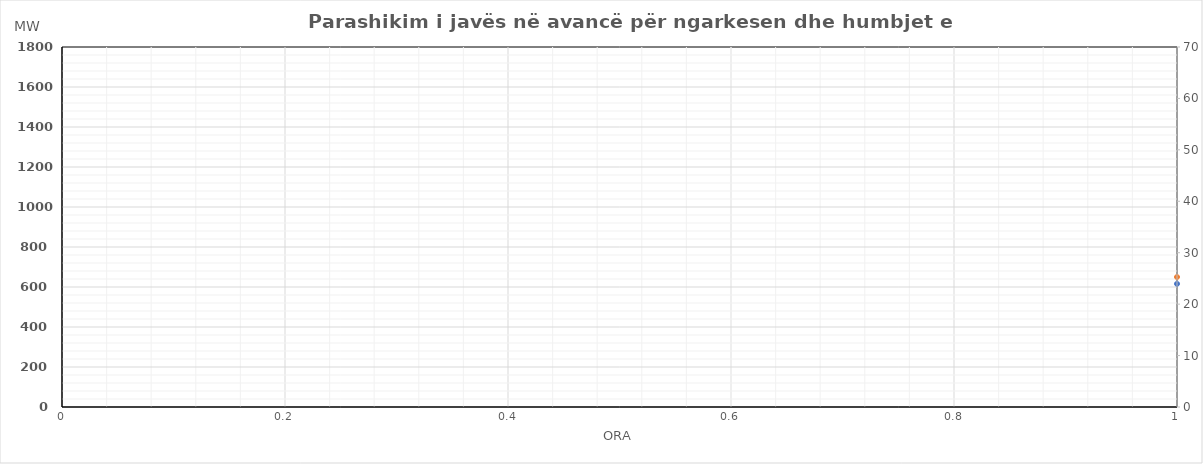
| Category | Ngarkesa (MWh) |
|---|---|
| 0 | 649.95 |
| 1 | 598.35 |
| 2 | 594.85 |
| 3 | 591.86 |
| 4 | 592.15 |
| 5 | 598.76 |
| 6 | 796.39 |
| 7 | 1085.77 |
| 8 | 1193.92 |
| 9 | 1168.14 |
| 10 | 1131.74 |
| 11 | 1086.17 |
| 12 | 1060.81 |
| 13 | 1088.71 |
| 14 | 1125.69 |
| 15 | 1158.7 |
| 16 | 1250.84 |
| 17 | 1372.91 |
| 18 | 1385.93 |
| 19 | 1371.35 |
| 20 | 1342.96 |
| 21 | 1236.96 |
| 22 | 1061.14 |
| 23 | 857.15 |
| 24 | 700.24 |
| 25 | 615.14 |
| 26 | 584.74 |
| 27 | 572.34 |
| 28 | 571.64 |
| 29 | 645.24 |
| 30 | 847.38 |
| 31 | 1139.75 |
| 32 | 1242.28 |
| 33 | 1242.51 |
| 34 | 1205.3 |
| 35 | 1178.14 |
| 36 | 1216.19 |
| 37 | 1248.5 |
| 38 | 1358.46 |
| 39 | 1353.03 |
| 40 | 1421.7 |
| 41 | 1512.33 |
| 42 | 1556.55 |
| 43 | 1547.36 |
| 44 | 1512.56 |
| 45 | 1397.47 |
| 46 | 1197.34 |
| 47 | 974.55 |
| 48 | 739.19 |
| 49 | 651.79 |
| 50 | 608.37 |
| 51 | 608.19 |
| 52 | 606.49 |
| 53 | 668.79 |
| 54 | 874.33 |
| 55 | 1180.21 |
| 56 | 1291.17 |
| 57 | 1282.58 |
| 58 | 1315.98 |
| 59 | 1194.13 |
| 60 | 1177.57 |
| 61 | 1177.07 |
| 62 | 1221.26 |
| 63 | 1260.21 |
| 64 | 1349.05 |
| 65 | 1474.31 |
| 66 | 1507.31 |
| 67 | 1484.64 |
| 68 | 1453.93 |
| 69 | 1336.85 |
| 70 | 1132.86 |
| 71 | 922.96 |
| 72 | 738.7 |
| 73 | 643.9 |
| 74 | 599.88 |
| 75 | 586.29 |
| 76 | 596.07 |
| 77 | 673.96 |
| 78 | 900.69 |
| 79 | 1221.8 |
| 80 | 1324.28 |
| 81 | 1315.42 |
| 82 | 1243.47 |
| 83 | 1190.88 |
| 84 | 1100.59 |
| 85 | 1129.37 |
| 86 | 1171.71 |
| 87 | 1228.78 |
| 88 | 1320.75 |
| 89 | 1470.45 |
| 90 | 1537.15 |
| 91 | 1525.06 |
| 92 | 1483.43 |
| 93 | 1357.82 |
| 94 | 1160.62 |
| 95 | 940.54 |
| 96 | 750.18 |
| 97 | 640.69 |
| 98 | 590.56 |
| 99 | 574.88 |
| 100 | 585.36 |
| 101 | 660.45 |
| 102 | 869.39 |
| 103 | 1170.38 |
| 104 | 1264.56 |
| 105 | 1256.3 |
| 106 | 1172.35 |
| 107 | 1120.7 |
| 108 | 1109.59 |
| 109 | 1130.79 |
| 110 | 1155.79 |
| 111 | 1189.9 |
| 112 | 1275.22 |
| 113 | 1442.42 |
| 114 | 1471.73 |
| 115 | 1454.71 |
| 116 | 1421.17 |
| 117 | 1299.97 |
| 118 | 1101.06 |
| 119 | 880.06 |
| 120 | 709.59 |
| 121 | 619.99 |
| 122 | 578.65 |
| 123 | 565.48 |
| 124 | 573.27 |
| 125 | 634.63 |
| 126 | 779.23 |
| 127 | 990.17 |
| 128 | 1163.33 |
| 129 | 1214.78 |
| 130 | 1179.33 |
| 131 | 1139.33 |
| 132 | 1125.8 |
| 133 | 1148.58 |
| 134 | 1239.16 |
| 135 | 1284.52 |
| 136 | 1359.64 |
| 137 | 1403.46 |
| 138 | 1411.85 |
| 139 | 1391.37 |
| 140 | 1347.69 |
| 141 | 1229.4 |
| 142 | 1078.75 |
| 143 | 914.75 |
| 144 | 746.11 |
| 145 | 670.47 |
| 146 | 602.1 |
| 147 | 573.23 |
| 148 | 573.6 |
| 149 | 621.94 |
| 150 | 729.84 |
| 151 | 920.8 |
| 152 | 1096.01 |
| 153 | 1173.9 |
| 154 | 1177.41 |
| 155 | 1109.67 |
| 156 | 1104.66 |
| 157 | 1134.07 |
| 158 | 1142.36 |
| 159 | 1172.41 |
| 160 | 1329.99 |
| 161 | 1440.22 |
| 162 | 1446.84 |
| 163 | 1441.22 |
| 164 | 1356.53 |
| 165 | 1232.04 |
| 166 | 1047.47 |
| 167 | 833.55 |